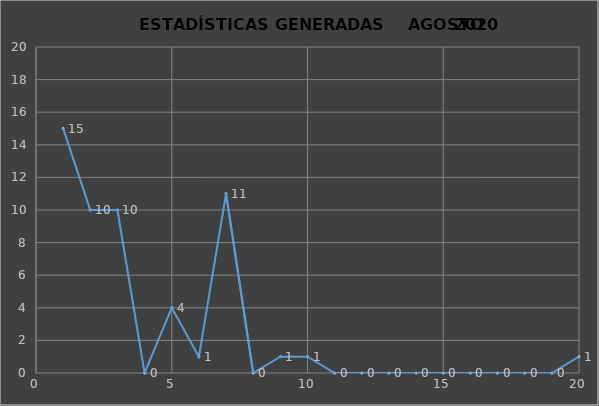
| Category |                   ESTADÍSTICAS GENERADAS     PERÍODO AGOSTO 2020 CANTIDAD |
|---|---|
| 0 | 15 |
| 1 | 10 |
| 2 | 10 |
| 3 | 0 |
| 4 | 4 |
| 5 | 1 |
| 6 | 11 |
| 7 | 0 |
| 8 | 1 |
| 9 | 1 |
| 10 | 0 |
| 11 | 0 |
| 12 | 0 |
| 13 | 0 |
| 14 | 0 |
| 15 | 0 |
| 16 | 0 |
| 17 | 0 |
| 18 | 0 |
| 19 | 1 |